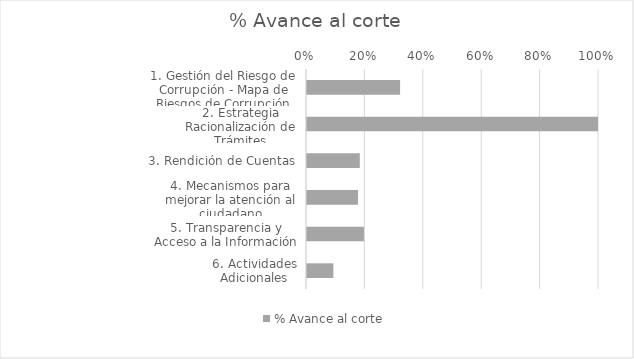
| Category | % Avance al corte |
|---|---|
| 1. Gestión del Riesgo de Corrupción - Mapa de Riesgos de Corrupción | 0.322 |
| 2. Estrategia Racionalización de Trámites | 1 |
| 3. Rendición de Cuentas | 0.184 |
| 4. Mecanismos para mejorar la atención al ciudadano | 0.178 |
| 5. Transparencia y Acceso a la Información | 0.198 |
| 6. Actividades Adicionales | 0.094 |